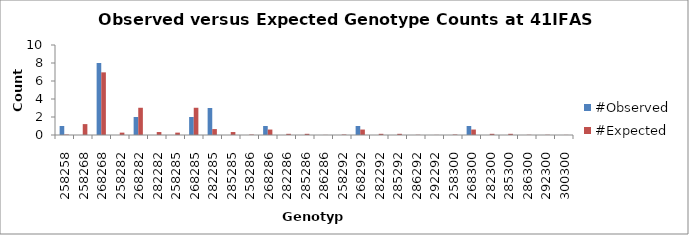
| Category | #Observed | #Expected |
|---|---|---|
| 258258.0 | 1 | 0.053 |
| 258268.0 | 0 | 1.211 |
| 268268.0 | 8 | 6.961 |
| 258282.0 | 0 | 0.263 |
| 268282.0 | 2 | 3.026 |
| 282282.0 | 0 | 0.329 |
| 258285.0 | 0 | 0.263 |
| 268285.0 | 2 | 3.026 |
| 282285.0 | 3 | 0.658 |
| 285285.0 | 0 | 0.329 |
| 258286.0 | 0 | 0.053 |
| 268286.0 | 1 | 0.605 |
| 282286.0 | 0 | 0.132 |
| 285286.0 | 0 | 0.132 |
| 286286.0 | 0 | 0.013 |
| 258292.0 | 0 | 0.053 |
| 268292.0 | 1 | 0.605 |
| 282292.0 | 0 | 0.132 |
| 285292.0 | 0 | 0.132 |
| 286292.0 | 0 | 0.026 |
| 292292.0 | 0 | 0.013 |
| 258300.0 | 0 | 0.053 |
| 268300.0 | 1 | 0.605 |
| 282300.0 | 0 | 0.132 |
| 285300.0 | 0 | 0.132 |
| 286300.0 | 0 | 0.026 |
| 292300.0 | 0 | 0.026 |
| 300300.0 | 0 | 0.013 |